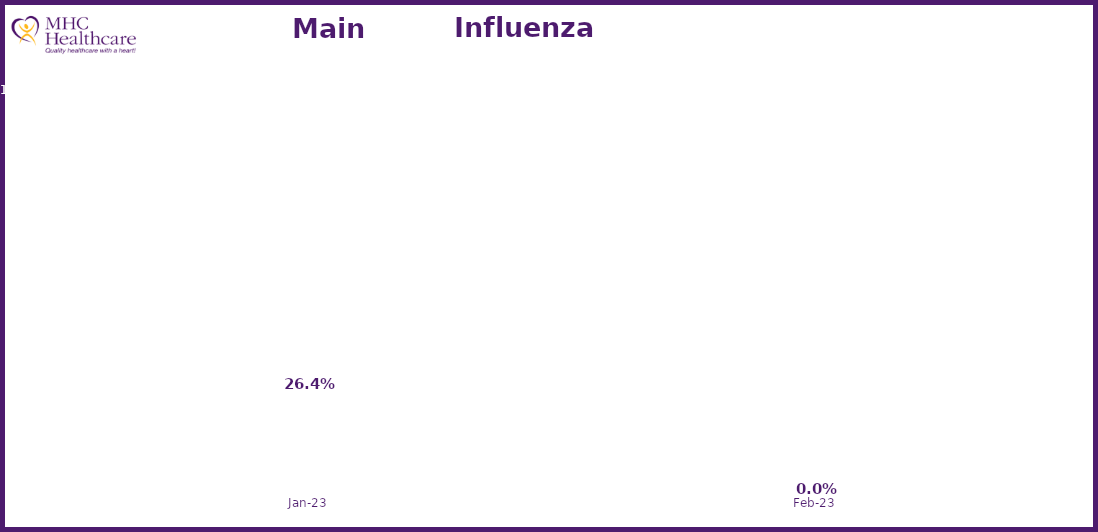
| Category | Online Access to Health Information |
|---|---|
| 2023-01-01 | 0.264 |
| 2023-02-01 | 0 |